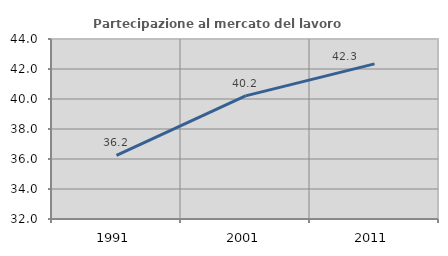
| Category | Partecipazione al mercato del lavoro  femminile |
|---|---|
| 1991.0 | 36.248 |
| 2001.0 | 40.207 |
| 2011.0 | 42.342 |